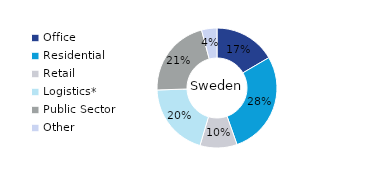
| Category | Sweden |
|---|---|
| Office | 0.166 |
| Residential | 0.28 |
| Retail | 0.1 |
| Logistics* | 0.199 |
| Public Sector | 0.214 |
| Other | 0.041 |